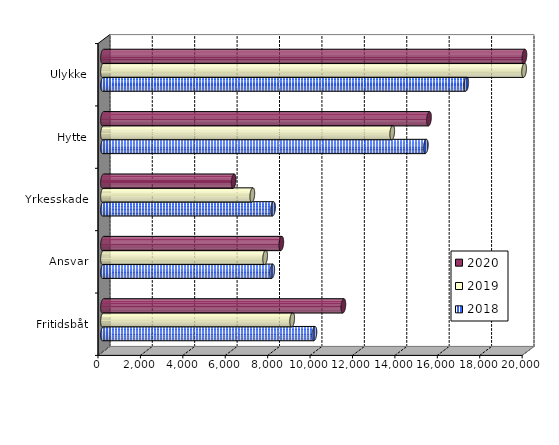
| Category | 2018 | 2019 | 2020 |
|---|---|---|---|
| Fritidsbåt | 9968.629 | 8920.456 | 11333.993 |
| Ansvar | 7980.507 | 7645.16 | 8406.96 |
| Yrkesskade | 8017.537 | 7040.453 | 6161.354 |
| Hytte | 15222.904 | 13638.058 | 15370.772 |
| Ulykke | 17128.16 | 19854.918 | 19871.118 |